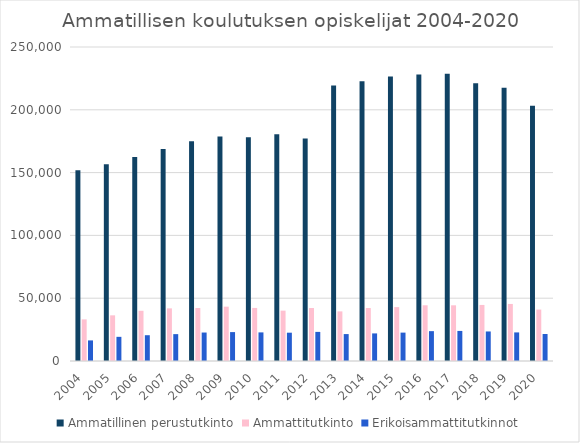
| Category | Ammatillinen perustutkinto | Ammattitutkinto | Erikoisammattitutkinnot |
|---|---|---|---|
| 2004.0 | 151905 | 33132 | 16398 |
| 2005.0 | 156606 | 36360 | 19239 |
| 2006.0 | 162435 | 39981 | 20529 |
| 2007.0 | 168840 | 41913 | 21393 |
| 2008.0 | 175053 | 42180 | 22665 |
| 2009.0 | 178779 | 43257 | 23010 |
| 2010.0 | 178110 | 42243 | 22776 |
| 2011.0 | 180459 | 40098 | 22539 |
| 2012.0 | 177102 | 42186 | 23178 |
| 2013.0 | 219402 | 39498 | 21435 |
| 2014.0 | 222759 | 42177 | 21966 |
| 2015.0 | 226470 | 42900 | 22602 |
| 2016.0 | 228042 | 44367 | 23769 |
| 2017.0 | 228663 | 44337 | 23940 |
| 2018.0 | 221127 | 44628 | 23514 |
| 2019.0 | 217473 | 45417 | 22764 |
| 2020.0 | 203157 | 40944 | 21486 |